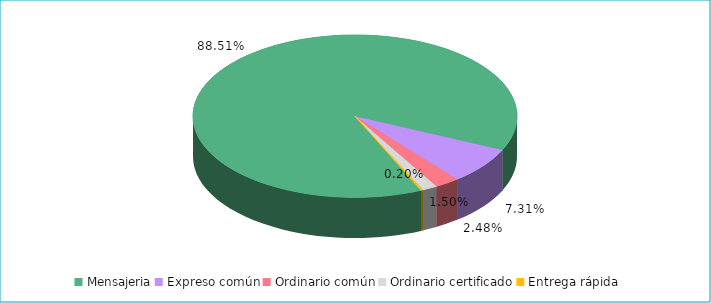
| Category | Series 0 |
|---|---|
| Mensajeria | 0.885 |
| Expreso común | 0.073 |
| Ordinario común | 0.025 |
| Ordinario certificado | 0.015 |
| Entrega rápida | 0.002 |